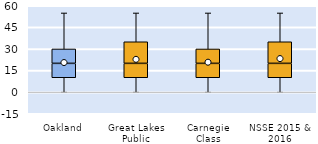
| Category | 25th | 50th | 75th |
|---|---|---|---|
| Oakland | 10 | 10 | 10 |
| Great Lakes Public | 10 | 10 | 15 |
| Carnegie Class | 10 | 10 | 10 |
| NSSE 2015 & 2016 | 10 | 10 | 15 |